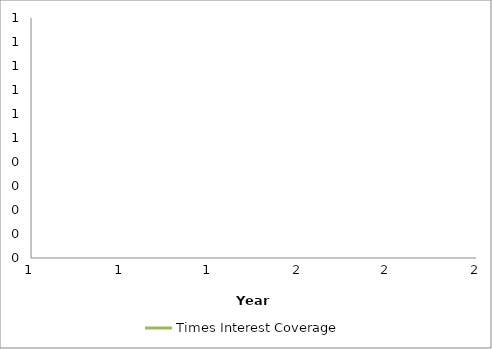
| Category | Times Interest Coverage |
|---|---|
| 0 | 0 |
| 1 | 0 |
| 2 | 0 |
| 3 | 0 |
| 4 | 0 |
| 5 | 0 |
| 6 | 0 |
| 7 | 0 |
| 8 | 0 |
| 9 | 0 |